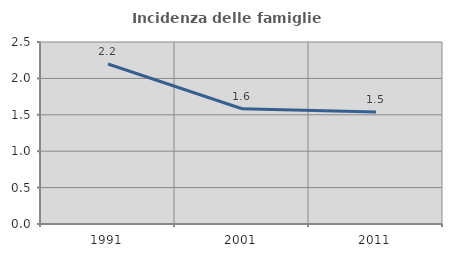
| Category | Incidenza delle famiglie numerose |
|---|---|
| 1991.0 | 2.198 |
| 2001.0 | 1.583 |
| 2011.0 | 1.538 |